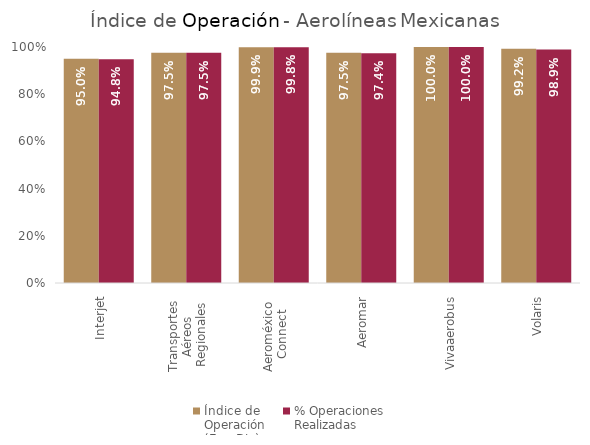
| Category | Índice de 
Operación
(Ene-Dic) | % Operaciones
Realizadas |
|---|---|---|
| Interjet | 0.95 | 0.948 |
| Transportes 
Aéreos 
Regionales | 0.975 | 0.975 |
| Aeroméxico 
Connect | 0.999 | 0.998 |
| Aeromar | 0.975 | 0.974 |
| Vivaaerobus | 1 | 1 |
| Volaris | 0.992 | 0.989 |